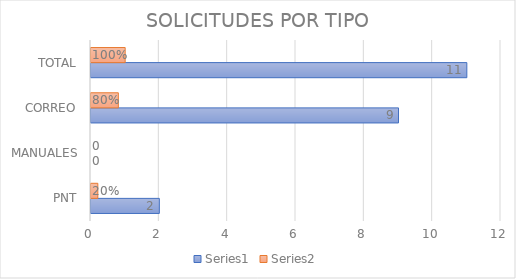
| Category | Series 0 | Series 1 |
|---|---|---|
| PNT | 2 | 0.2 |
| MANUALES | 0 | 0 |
| CORREO | 9 | 0.8 |
| TOTAL | 11 | 1 |